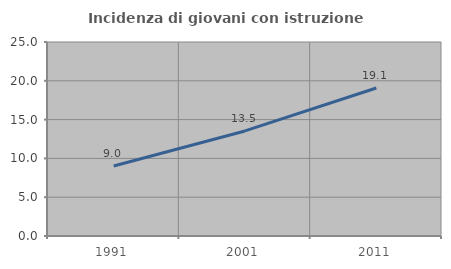
| Category | Incidenza di giovani con istruzione universitaria |
|---|---|
| 1991.0 | 9.016 |
| 2001.0 | 13.539 |
| 2011.0 | 19.068 |